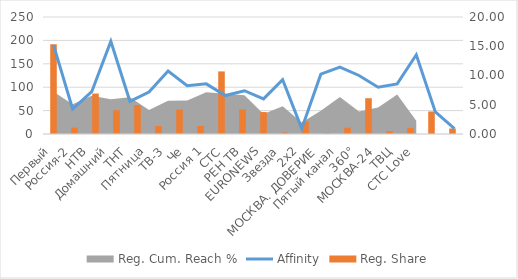
| Category | Reg. Share |
|---|---|
| Первый | 15.34 |
| Россия-2 | 1.1 |
| НТВ | 6.91 |
| Домашний | 4.07 |
| ТНТ | 4.93 |
| Пятница | 1.37 |
| ТВ-3 | 4.16 |
| Че | 1.38 |
| Россия 1 | 10.7 |
| СТС | 4.2 |
| РЕН ТВ | 3.75 |
| EURONEWS | 0.26 |
| Звезда | 2.14 |
| 2x2 | 0.17 |
| МОСКВА. ДОВЕРИЕ | 1.09 |
| Пятый канал | 6.12 |
| 360° | 0.48 |
| МОСКВА-24 | 1.05 |
| ТВЦ | 3.85 |
| СТС Love | 0.94 |